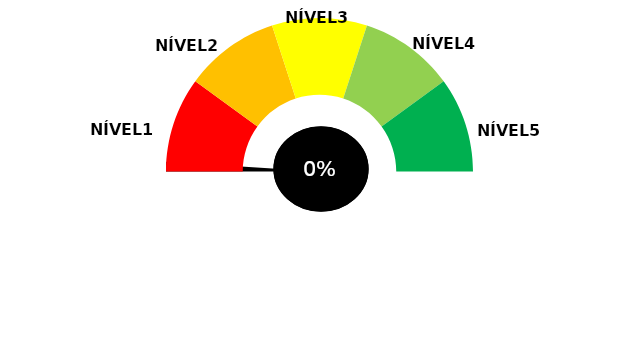
| Category | pizza |
|---|---|
| 0 | 0 |
| 1 | 0.02 |
| 2 | 1.98 |